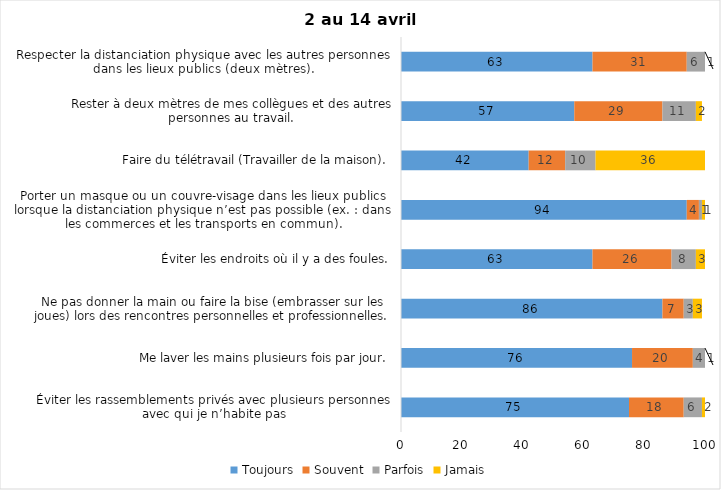
| Category | Toujours | Souvent | Parfois | Jamais |
|---|---|---|---|---|
| Éviter les rassemblements privés avec plusieurs personnes avec qui je n’habite pas | 75 | 18 | 6 | 2 |
| Me laver les mains plusieurs fois par jour. | 76 | 20 | 4 | 1 |
| Ne pas donner la main ou faire la bise (embrasser sur les joues) lors des rencontres personnelles et professionnelles. | 86 | 7 | 3 | 3 |
| Éviter les endroits où il y a des foules. | 63 | 26 | 8 | 3 |
| Porter un masque ou un couvre-visage dans les lieux publics lorsque la distanciation physique n’est pas possible (ex. : dans les commerces et les transports en commun). | 94 | 4 | 1 | 1 |
| Faire du télétravail (Travailler de la maison). | 42 | 12 | 10 | 36 |
| Rester à deux mètres de mes collègues et des autres personnes au travail. | 57 | 29 | 11 | 2 |
| Respecter la distanciation physique avec les autres personnes dans les lieux publics (deux mètres). | 63 | 31 | 6 | 1 |